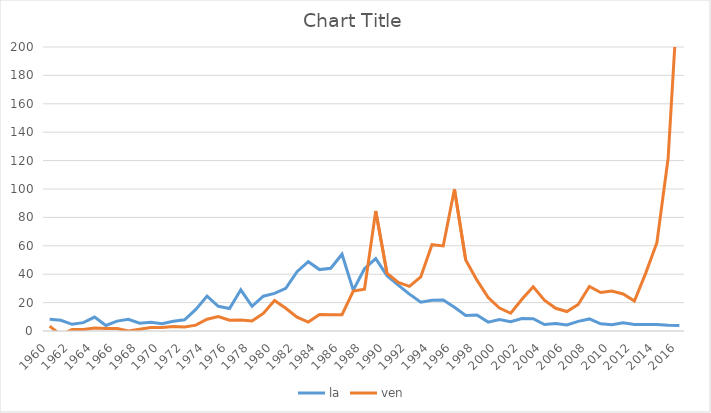
| Category | la | ven  |
|---|---|---|
| 1960.0 | 8.2 | 3.4 |
| 1961.0 | 7.561 | -2.8 |
| 1962.0 | 4.7 | 1 |
| 1963.0 | 5.9 | 1.1 |
| 1964.0 | 9.8 | 2.1 |
| 1965.0 | 3.9 | 1.7 |
| 1966.0 | 6.952 | 1.8 |
| 1967.0 | 8.3 | 0 |
| 1968.0 | 5.471 | 1.3 |
| 1969.0 | 6.2 | 2.4 |
| 1970.0 | 5.1 | 2.5 |
| 1971.0 | 6.8 | 3.2 |
| 1972.0 | 7.9 | 2.8 |
| 1973.0 | 15.2 | 4.1 |
| 1974.0 | 24.6 | 8.3 |
| 1975.0 | 17.4 | 10.2 |
| 1976.0 | 15.8 | 7.6 |
| 1977.0 | 29 | 7.8 |
| 1978.0 | 17.4 | 7.1 |
| 1979.0 | 24.5 | 12.4 |
| 1980.0 | 26.5 | 21.5 |
| 1981.0 | 30.017 | 16 |
| 1982.0 | 41.75 | 9.7 |
| 1983.0 | 48.8 | 6.3 |
| 1984.0 | 43.25 | 11.6 |
| 1985.0 | 44.2 | 11.4 |
| 1986.0 | 54.05 | 11.5 |
| 1987.0 | 28.8 | 28.1 |
| 1988.0 | 43.85 | 29.5 |
| 1989.0 | 51 | 84.5 |
| 1990.0 | 39 | 40.7 |
| 1991.0 | 32.3 | 34.2 |
| 1992.0 | 25.95 | 31.4 |
| 1993.0 | 20.3 | 38.1 |
| 1994.0 | 21.7 | 60.8 |
| 1995.0 | 21.9 | 59.9 |
| 1996.0 | 16.65 | 99.9 |
| 1997.0 | 10.9 | 50 |
| 1998.0 | 11.2 | 35.8 |
| 1999.0 | 6.25 | 23.6 |
| 2000.0 | 8 | 16.2 |
| 2001.0 | 6.6 | 12.5 |
| 2002.0 | 8.85 | 22.4 |
| 2003.0 | 8.65 | 31.1 |
| 2004.0 | 4.569 | 21.7 |
| 2005.0 | 5.197 | 16 |
| 2006.0 | 4.293 | 13.7 |
| 2007.0 | 6.8 | 18.7 |
| 2008.0 | 8.5 | 31.4 |
| 2009.0 | 5.05 | 27.1 |
| 2010.0 | 4.45 | 28.2 |
| 2011.0 | 5.75 | 26.1 |
| 2012.0 | 4.509 | 21.1 |
| 2013.0 | 4.5 | 40.6 |
| 2014.0 | 4.5 | 62.2 |
| 2015.0 | 4.061 | 121.7 |
| 2016.0 | 3.8 | 254.9 |